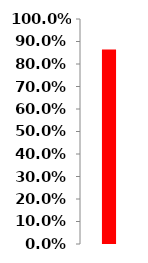
| Category | Series 0 |
|---|---|
| 0 | 0.864 |